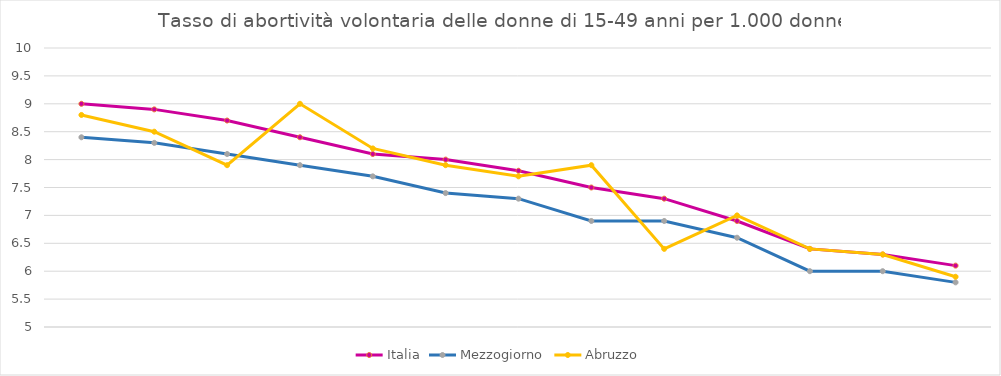
| Category | Italia | Mezzogiorno | Abruzzo |
|---|---|---|---|
| 0 | 9 | 8.4 | 8.8 |
| 1 | 8.9 | 8.3 | 8.5 |
| 2 | 8.7 | 8.1 | 7.9 |
| 3 | 8.4 | 7.9 | 9 |
| 4 | 8.1 | 7.7 | 8.2 |
| 5 | 8 | 7.4 | 7.9 |
| 6 | 7.8 | 7.3 | 7.7 |
| 7 | 7.5 | 6.9 | 7.9 |
| 8 | 7.3 | 6.9 | 6.4 |
| 9 | 6.9 | 6.6 | 7 |
| 10 | 6.4 | 6 | 6.4 |
| 11 | 6.3 | 6 | 6.3 |
| 12 | 6.1 | 5.8 | 5.9 |